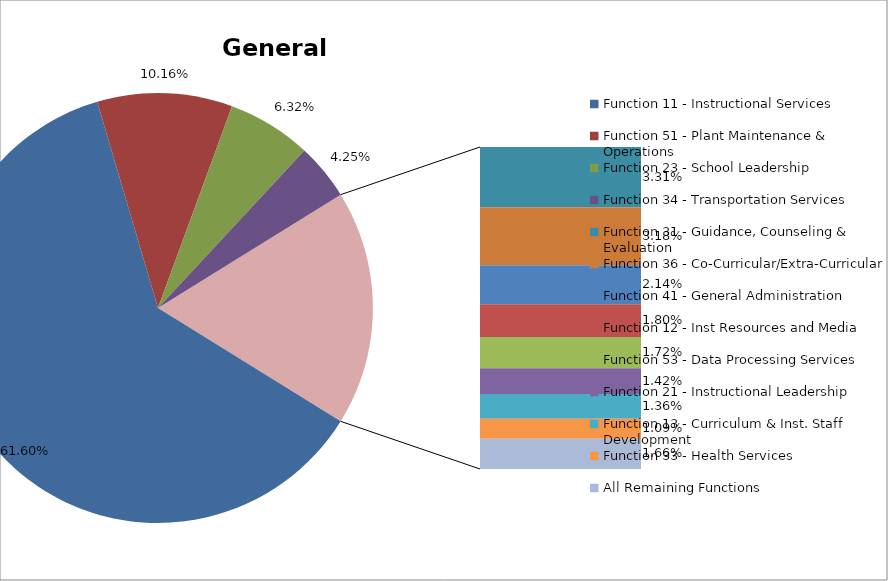
| Category | Series 0 |
|---|---|
| Function 11 - Instructional Services | 0.616 |
| Function 51 - Plant Maintenance & Operations | 0.102 |
| Function 23 - School Leadership | 0.063 |
| Function 34 - Transportation Services | 0.042 |
| Function 31 - Guidance, Counseling & Evaluation | 0.033 |
| Function 36 - Co-Curricular/Extra-Curricular | 0.032 |
| Function 41 - General Administration | 0.021 |
| Function 12 - Inst Resources and Media | 0.018 |
| Function 53 - Data Processing Services | 0.017 |
| Function 21 - Instructional Leadership | 0.014 |
| Function 13 - Curriculum & Inst. Staff Development | 0.014 |
| Function 33 - Health Services | 0.011 |
| All Remaining Functions | 0.017 |